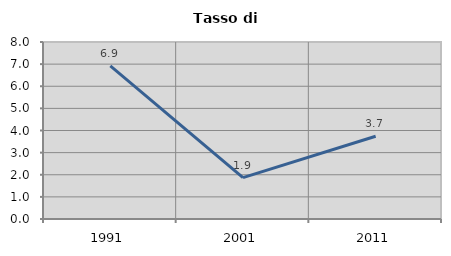
| Category | Tasso di disoccupazione   |
|---|---|
| 1991.0 | 6.918 |
| 2001.0 | 1.869 |
| 2011.0 | 3.738 |